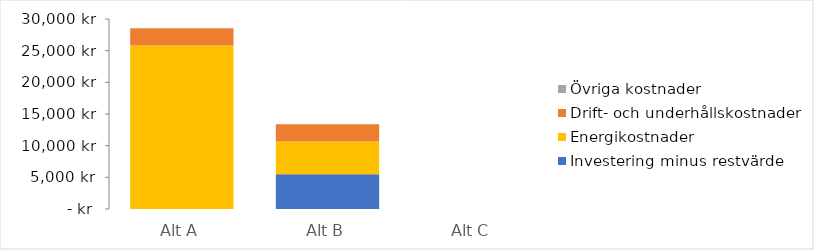
| Category | Investering minus restvärde | Energikostnader | Drift- och underhållskostnader | Övriga kostnader |
|---|---|---|---|---|
| Alt A | 0 | 25834.105 | 2718.065 | 0 |
| Alt B | 5500 | 5166.821 | 2718.065 | 0 |
| Alt C | 0 | 0 | 0 | 0 |